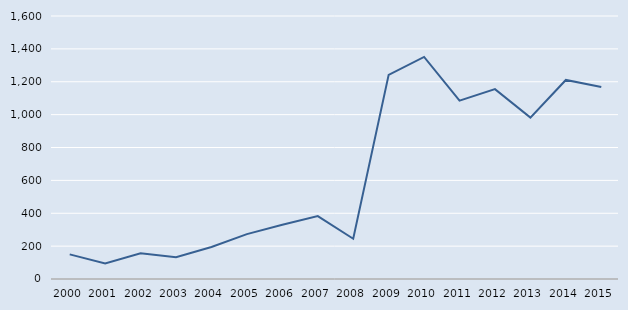
| Category | Series 0 |
|---|---|
| 2000.0 | 150 |
| 2001.0 | 94 |
| 2002.0 | 157 |
| 2003.0 | 132 |
| 2004.0 | 195 |
| 2005.0 | 273 |
| 2006.0 | 330 |
| 2007.0 | 383 |
| 2008.0 | 245 |
| 2009.0 | 1242 |
| 2010.0 | 1351 |
| 2011.0 | 1085 |
| 2012.0 | 1155 |
| 2013.0 | 982 |
| 2014.0 | 1211 |
| 2015.0 | 1168 |